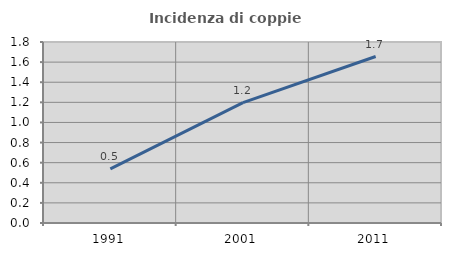
| Category | Incidenza di coppie miste |
|---|---|
| 1991.0 | 0.538 |
| 2001.0 | 1.197 |
| 2011.0 | 1.656 |